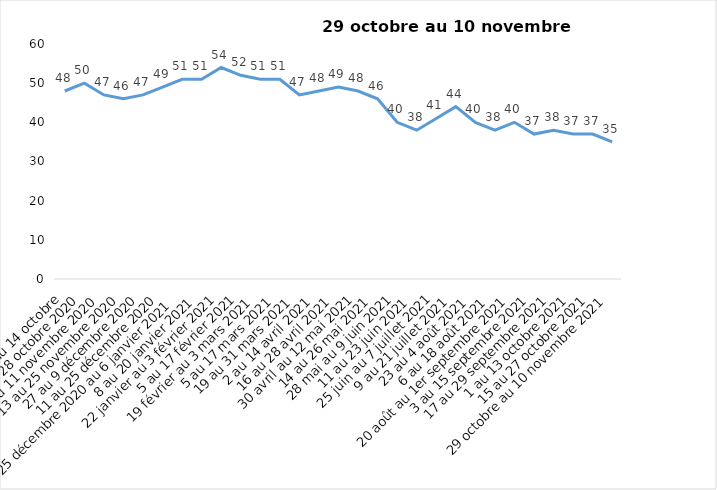
| Category | Toujours aux trois mesures |
|---|---|
| 2 au 14 octobre | 48 |
| 16 au 28 octobre 2020 | 50 |
| 30 octobre au 11 novembre 2020 | 47 |
| 13 au 25 novembre 2020 | 46 |
| 27 au 9 décembre 2020 | 47 |
| 11 au 25 décembre 2020 | 49 |
| 25 décembre 2020 au 6 janvier 2021 | 51 |
| 8 au 20 janvier 2021 | 51 |
| 22 janvier au 3 février 2021 | 54 |
| 5 au 17 février 2021 | 52 |
| 19 février au 3 mars 2021 | 51 |
| 5 au 17 mars 2021 | 51 |
| 19 au 31 mars 2021 | 47 |
| 2 au 14 avril 2021 | 48 |
| 16 au 28 avril 2021 | 49 |
| 30 avril au 12 mai 2021 | 48 |
| 14 au 26 mai 2021 | 46 |
| 28 mai au 9 juin 2021 | 40 |
| 11 au 23 juin 2021 | 38 |
| 25 juin au 7 juillet 2021 | 41 |
| 9 au 21 juillet 2021 | 44 |
| 23 au 4 août 2021 | 40 |
| 6 au 18 août 2021 | 38 |
| 20 août au 1er septembre 2021 | 40 |
| 3 au 15 septembre 2021 | 37 |
| 17 au 29 septembre 2021 | 38 |
| 1 au 13 octobre 2021 | 37 |
| 15 au 27 octobre 2021 | 37 |
| 29 octobre au 10 novembre 2021 | 35 |